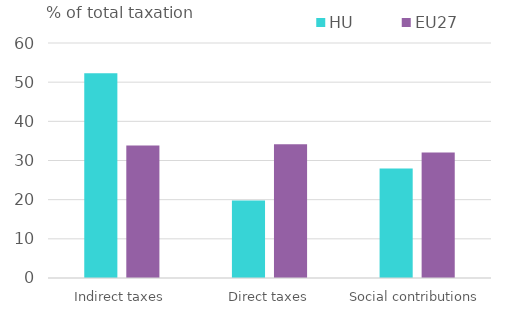
| Category | HU | EU27 |
|---|---|---|
| Indirect taxes | 52.27 | 33.811 |
| Direct taxes | 19.759 | 34.133 |
| Social contributions | 27.971 | 32.056 |